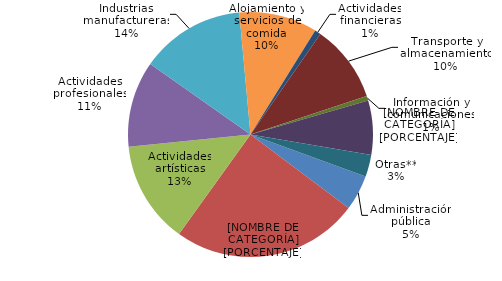
| Category | 51,0 |
|---|---|
| Administración pública | 62.077 |
| Comercio y reparación de vehículos | 327.989 |
| Actividades artísticas | 179.145 |
| Actividades profesionales | 150.691 |
| Industrias manufactureras | 183.169 |
| Alojamiento y servicios de comida | 137.113 |
| Actividades financieras | 10.653 |
| Transporte y almacenamiento | 135.922 |
| Información y comunicaciones | 8.398 |
| Construcción | 94.798 |
| Otras** | 38.405 |